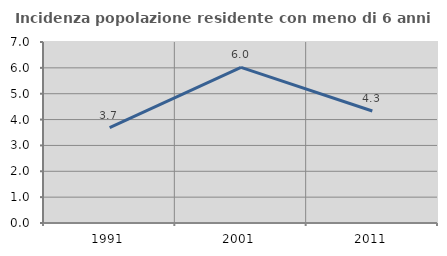
| Category | Incidenza popolazione residente con meno di 6 anni |
|---|---|
| 1991.0 | 3.69 |
| 2001.0 | 6.019 |
| 2011.0 | 4.332 |